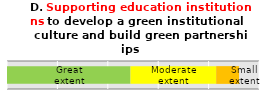
| Category | Series 0 | Series 1 | Series 2 |
|---|---|---|---|
|  | 49 | 34 | 9.091 |